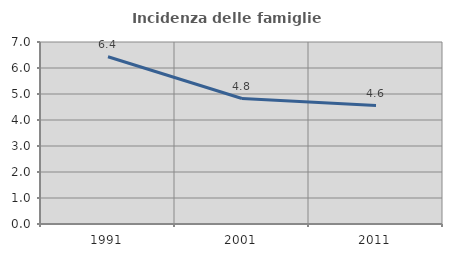
| Category | Incidenza delle famiglie numerose |
|---|---|
| 1991.0 | 6.433 |
| 2001.0 | 4.826 |
| 2011.0 | 4.557 |